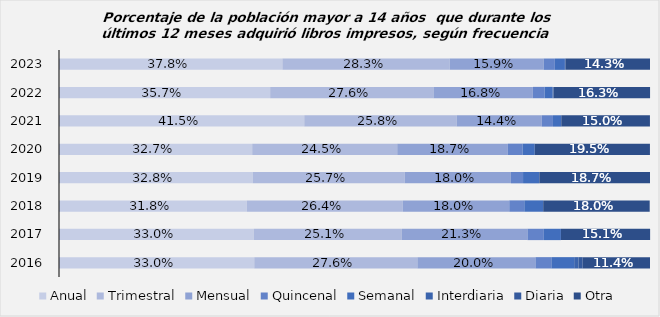
| Category | Anual | Trimestral | Mensual | Quincenal | Semanal | Interdiaria | Diaria | Otra |
|---|---|---|---|---|---|---|---|---|
| 2023.0 | 0.378 | 0.283 | 0.159 | 0.019 | 0.017 | 0.001 | 0 | 0.143 |
| 2022.0 | 0.357 | 0.276 | 0.168 | 0.02 | 0.014 | 0.001 | 0 | 0.163 |
| 2021.0 | 0.415 | 0.258 | 0.144 | 0.019 | 0.014 | 0 | 0 | 0.15 |
| 2020.0 | 0.327 | 0.245 | 0.187 | 0.025 | 0.021 | 0 | 0 | 0.195 |
| 2019.0 | 0.328 | 0.257 | 0.18 | 0.021 | 0.028 | 0 | 0 | 0.187 |
| 2018.0 | 0.318 | 0.264 | 0.18 | 0.025 | 0.032 | 0 | 0 | 0.18 |
| 2017.0 | 0.33 | 0.25 | 0.212 | 0.028 | 0.029 | 0 | 0 | 0.151 |
| 2016.0 | 0.33 | 0.276 | 0.2 | 0.027 | 0.039 | 0.007 | 0.007 | 0.114 |